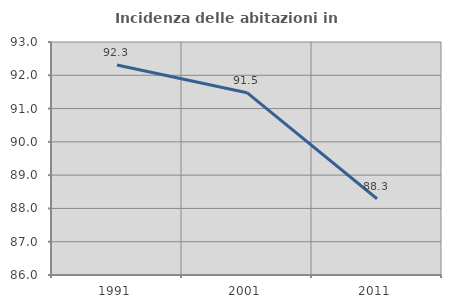
| Category | Incidenza delle abitazioni in proprietà  |
|---|---|
| 1991.0 | 92.308 |
| 2001.0 | 91.477 |
| 2011.0 | 88.292 |